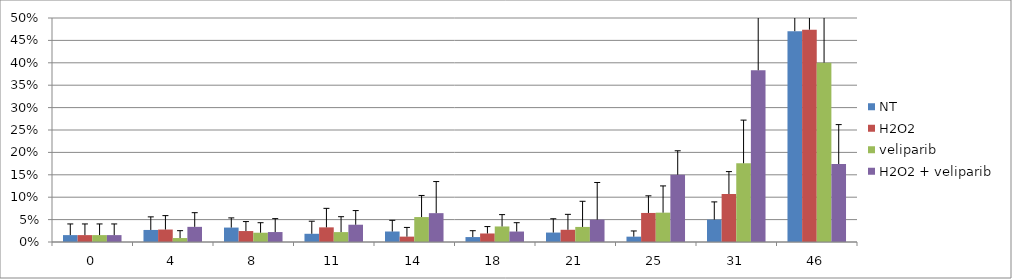
| Category | NT | H2O2 | veliparib | H2O2 + veliparib |
|---|---|---|---|---|
| 0.0 | 0.015 | 0.015 | 0.015 | 0.015 |
| 4.0 | 0.027 | 0.028 | 0.009 | 0.034 |
| 8.0 | 0.032 | 0.024 | 0.021 | 0.022 |
| 11.0 | 0.018 | 0.033 | 0.022 | 0.039 |
| 14.0 | 0.023 | 0.012 | 0.056 | 0.064 |
| 18.0 | 0.011 | 0.019 | 0.035 | 0.023 |
| 21.0 | 0.021 | 0.027 | 0.034 | 0.05 |
| 25.0 | 0.012 | 0.065 | 0.065 | 0.15 |
| 31.0 | 0.05 | 0.107 | 0.176 | 0.383 |
| 46.0 | 0.471 | 0.474 | 0.4 | 0.174 |